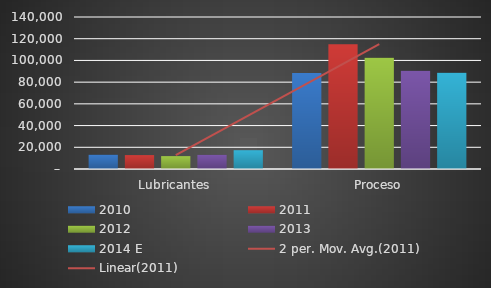
| Category | 2010 | 2011 | 2012 | 2013 | 2014 E |
|---|---|---|---|---|---|
| Lubricantes | 13182.138 | 12809.799 | 11863.296 | 13076.885 | 17317.597 |
| Proceso | 88492.041 | 114977.601 | 102357.46 | 90436.329 | 88561.088 |